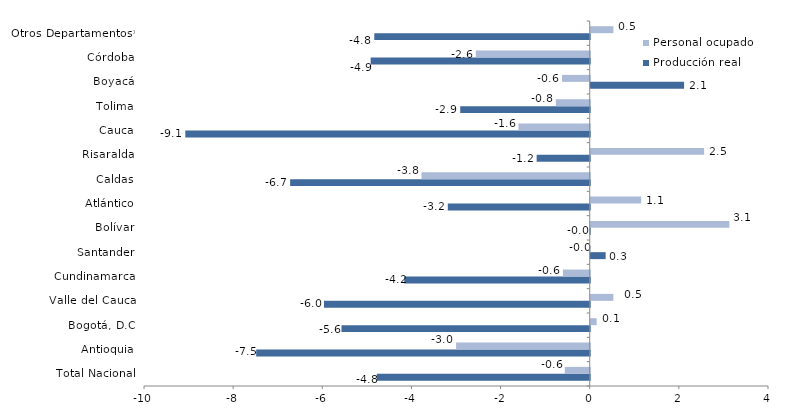
| Category | Producción real | Personal ocupado |
|---|---|---|
| Total Nacional | -4.776 | -0.559 |
| Antioquia | -7.483 | -2.998 |
| Bogotá, D.C | -5.569 | 0.133 |
| Valle del Cauca | -5.962 | 0.507 |
| Cundinamarca | -4.161 | -0.602 |
| Santander | 0.335 | -0.005 |
| Bolívar | -0.006 | 3.111 |
| Atlántico | -3.184 | 1.133 |
| Caldas | -6.721 | -3.774 |
| Risaralda | -1.191 | 2.544 |
| Cauca | -9.073 | -1.599 |
| Tolima | -2.905 | -0.761 |
| Boyacá | 2.095 | -0.621 |
| Córdoba | -4.915 | -2.555 |
| Otros Departamentos* | -4.833 | 0.509 |